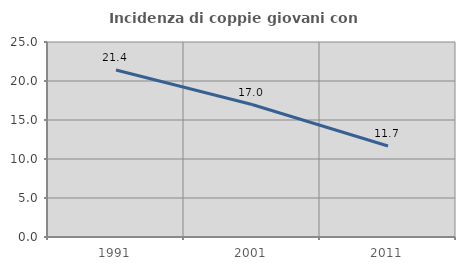
| Category | Incidenza di coppie giovani con figli |
|---|---|
| 1991.0 | 21.414 |
| 2001.0 | 16.981 |
| 2011.0 | 11.672 |